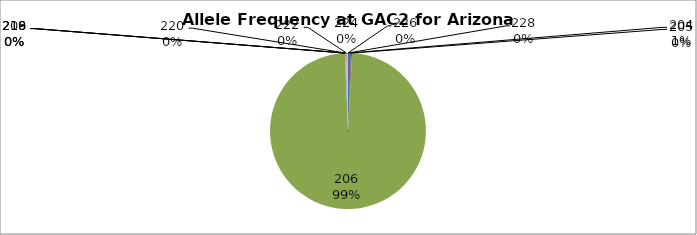
| Category | Series 0 |
|---|---|
| 204.0 | 0.006 |
| 205.0 | 0.002 |
| 206.0 | 0.985 |
| 209.0 | 0 |
| 216.0 | 0 |
| 218.0 | 0 |
| 220.0 | 0.002 |
| 222.0 | 0.002 |
| 224.0 | 0.002 |
| 226.0 | 0 |
| 228.0 | 0 |